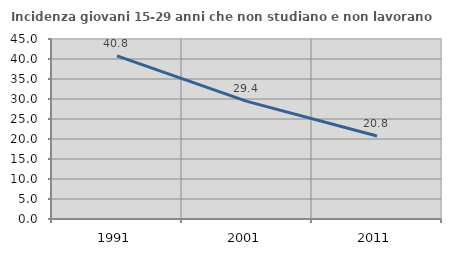
| Category | Incidenza giovani 15-29 anni che non studiano e non lavorano  |
|---|---|
| 1991.0 | 40.802 |
| 2001.0 | 29.412 |
| 2011.0 | 20.755 |